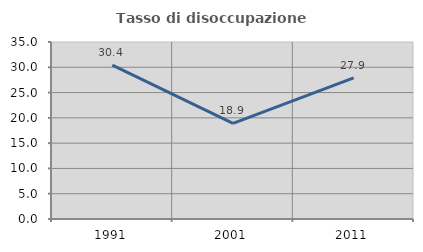
| Category | Tasso di disoccupazione giovanile  |
|---|---|
| 1991.0 | 30.415 |
| 2001.0 | 18.919 |
| 2011.0 | 27.907 |